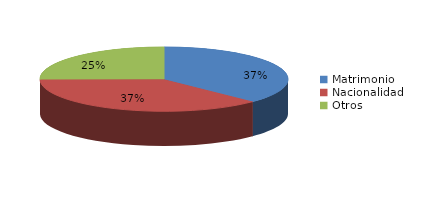
| Category | Series 0 |
|---|---|
| Matrimonio | 674 |
| Nacionalidad | 676 |
| Otros | 455 |